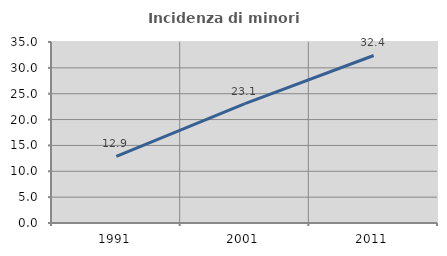
| Category | Incidenza di minori stranieri |
|---|---|
| 1991.0 | 12.903 |
| 2001.0 | 23.077 |
| 2011.0 | 32.394 |